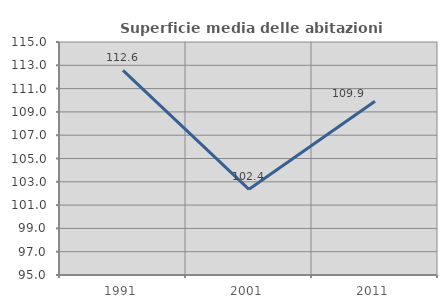
| Category | Superficie media delle abitazioni occupate |
|---|---|
| 1991.0 | 112.561 |
| 2001.0 | 102.353 |
| 2011.0 | 109.916 |